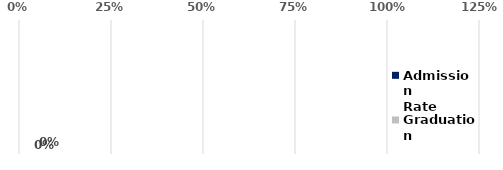
| Category | Admission
Rate | Graduation
Rate |
|---|---|---|
| 24 or Under | 0 | 0 |
| 25 to 34 | 0 | 0 |
| 35 to 59 | 0 | 0 |
| 60 or Over | 0 | 0 |
| Total | 0 | 0 |